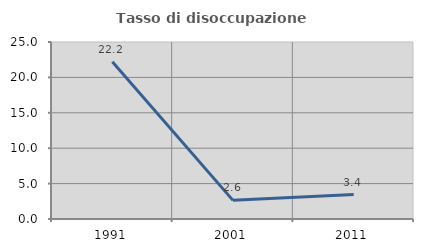
| Category | Tasso di disoccupazione giovanile  |
|---|---|
| 1991.0 | 22.222 |
| 2001.0 | 2.632 |
| 2011.0 | 3.448 |